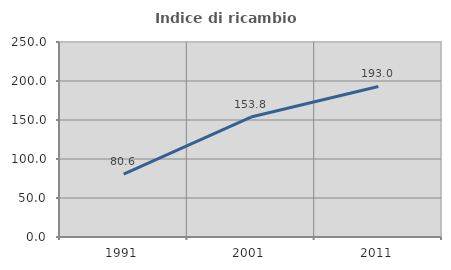
| Category | Indice di ricambio occupazionale  |
|---|---|
| 1991.0 | 80.597 |
| 2001.0 | 153.75 |
| 2011.0 | 193.043 |